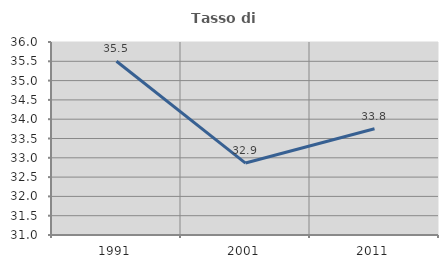
| Category | Tasso di occupazione   |
|---|---|
| 1991.0 | 35.5 |
| 2001.0 | 32.863 |
| 2011.0 | 33.754 |